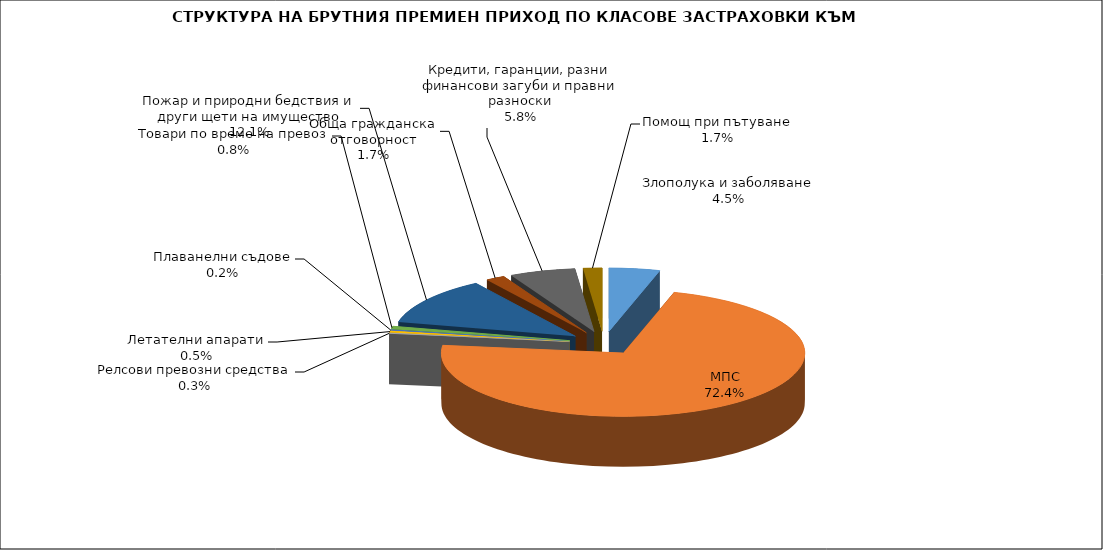
| Category | Злополука и заболяване |
|---|---|
| Злополука и заболяване | 0.045 |
| МПС | 0.724 |
| Релсови превозни средства | 0.003 |
| Летателни апарати | 0.005 |
| Плаванелни съдове | 0.002 |
| Товари по време на превоз | 0.008 |
| Пожар и природни бедствия и други щети на имущество | 0.121 |
| Обща гражданска отговорност | 0.017 |
| Кредити, гаранции, разни финансови загуби и правни разноски | 0.058 |
| Помощ при пътуване | 0.017 |